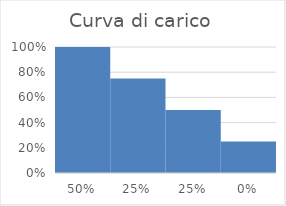
| Category | Series 0 |
|---|---|
| 0.5 | 1 |
| 0.25 | 0.75 |
| 0.25 | 0.5 |
| 0.0 | 0.25 |